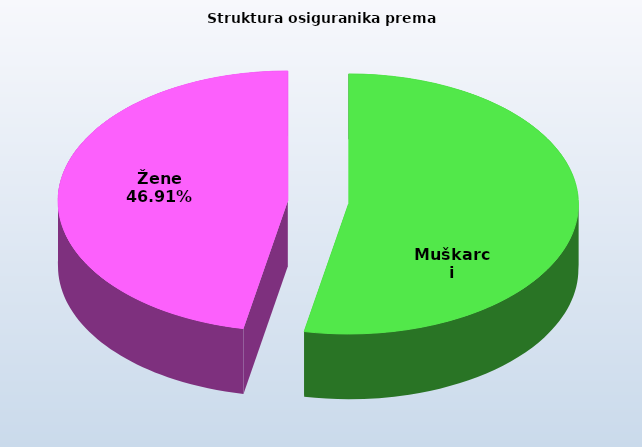
| Category | Series 0 |
|---|---|
| Muškarci | 825214 |
| Žene | 729116 |